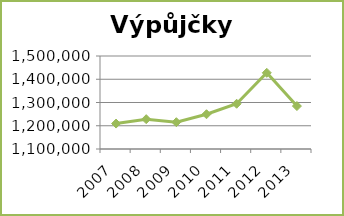
| Category | Výpůjčky celkem |
|---|---|
| 2007.0 | 1209407 |
| 2008.0 | 1228262 |
| 2009.0 | 1215273 |
| 2010.0 | 1249493 |
| 2011.0 | 1294603 |
| 2012.0 | 1427682 |
| 2013.0 | 1284674 |